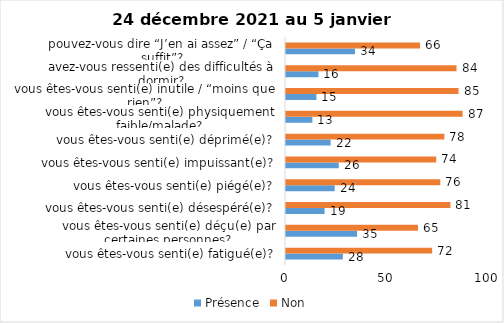
| Category | Présence | Non |
|---|---|---|
| vous êtes-vous senti(e) fatigué(e)? | 28 | 72 |
| vous êtes-vous senti(e) déçu(e) par certaines personnes? | 35 | 65 |
| vous êtes-vous senti(e) désespéré(e)? | 19 | 81 |
| vous êtes-vous senti(e) piégé(e)? | 24 | 76 |
| vous êtes-vous senti(e) impuissant(e)? | 26 | 74 |
| vous êtes-vous senti(e) déprimé(e)? | 22 | 78 |
| vous êtes-vous senti(e) physiquement faible/malade? | 13 | 87 |
| vous êtes-vous senti(e) inutile / “moins que rien”? | 15 | 85 |
| avez-vous ressenti(e) des difficultés à dormir? | 16 | 84 |
| pouvez-vous dire “J’en ai assez” / “Ça suffit”? | 34 | 66 |